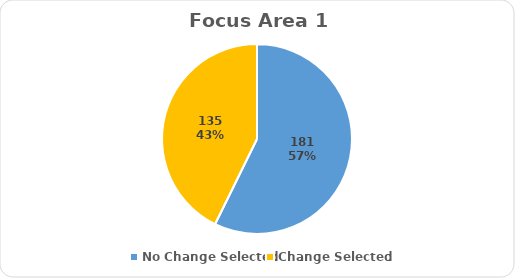
| Category | Series 0 |
|---|---|
| No Change Selected | 181 |
| Change Selected | 135 |